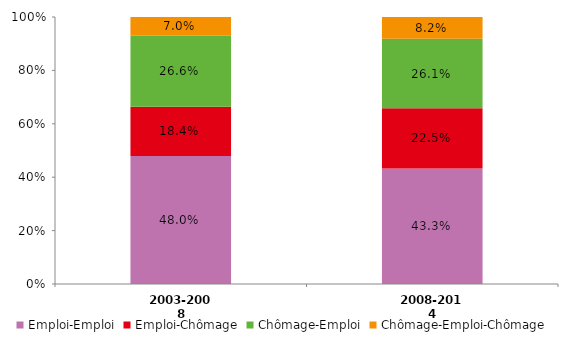
| Category | Emploi-Emploi | Emploi-Chômage | Chômage-Emploi | Chômage-Emploi-Chômage |
|---|---|---|---|---|
| 2003-2008 | 0.48 | 0.184 | 0.266 | 0.07 |
| 2008-2014 | 0.433 | 0.225 | 0.261 | 0.082 |